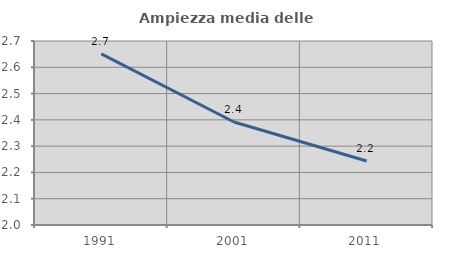
| Category | Ampiezza media delle famiglie |
|---|---|
| 1991.0 | 2.651 |
| 2001.0 | 2.392 |
| 2011.0 | 2.243 |